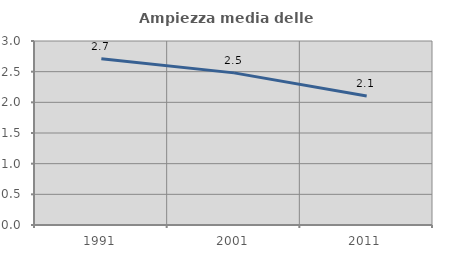
| Category | Ampiezza media delle famiglie |
|---|---|
| 1991.0 | 2.709 |
| 2001.0 | 2.48 |
| 2011.0 | 2.104 |